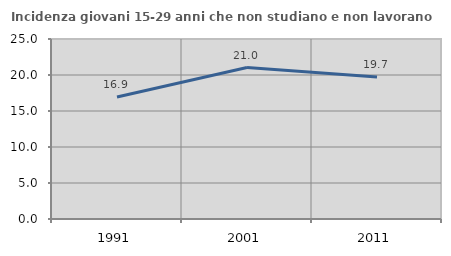
| Category | Incidenza giovani 15-29 anni che non studiano e non lavorano  |
|---|---|
| 1991.0 | 16.935 |
| 2001.0 | 21.03 |
| 2011.0 | 19.718 |